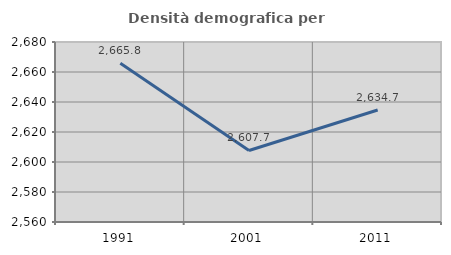
| Category | Densità demografica |
|---|---|
| 1991.0 | 2665.842 |
| 2001.0 | 2607.673 |
| 2011.0 | 2634.695 |